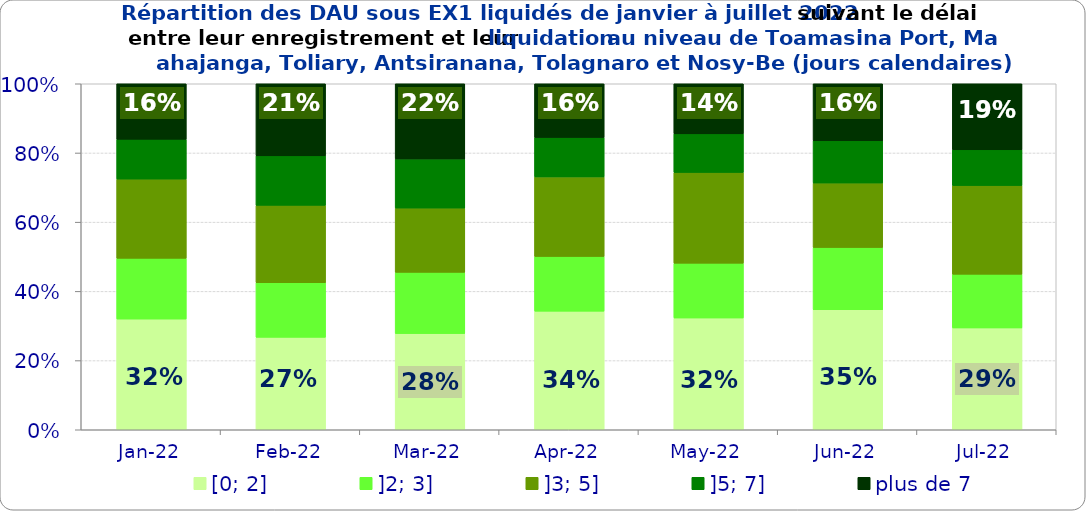
| Category | [0; 2] | ]2; 3] | ]3; 5] | ]5; 7] | plus de 7 |
|---|---|---|---|---|---|
| 2022-01-01 | 0.32 | 0.176 | 0.229 | 0.115 | 0.161 |
| 2022-02-01 | 0.267 | 0.158 | 0.223 | 0.143 | 0.208 |
| 2022-03-01 | 0.278 | 0.177 | 0.186 | 0.142 | 0.217 |
| 2022-04-01 | 0.343 | 0.158 | 0.23 | 0.114 | 0.155 |
| 2022-05-01 | 0.323 | 0.158 | 0.262 | 0.111 | 0.145 |
| 2022-06-01 | 0.347 | 0.18 | 0.186 | 0.122 | 0.165 |
| 2022-07-01 | 0.294 | 0.155 | 0.256 | 0.103 | 0.191 |